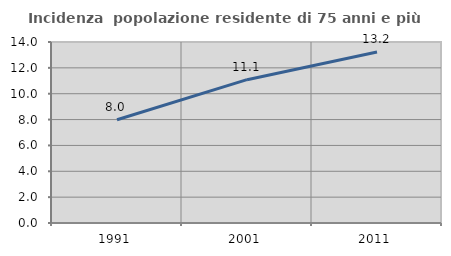
| Category | Incidenza  popolazione residente di 75 anni e più |
|---|---|
| 1991.0 | 7.985 |
| 2001.0 | 11.086 |
| 2011.0 | 13.232 |